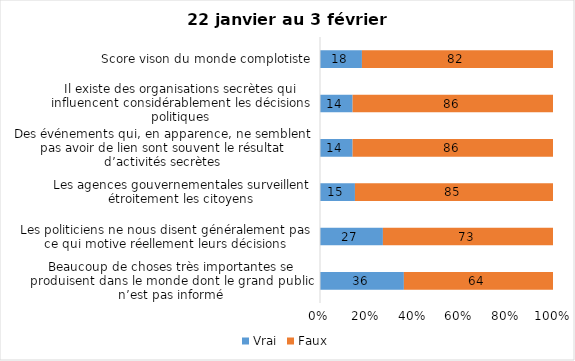
| Category | Vrai | Faux |
|---|---|---|
| Beaucoup de choses très importantes se produisent dans le monde dont le grand public n’est pas informé | 36 | 64 |
| Les politiciens ne nous disent généralement pas ce qui motive réellement leurs décisions | 27 | 73 |
| Les agences gouvernementales surveillent étroitement les citoyens | 15 | 85 |
| Des événements qui, en apparence, ne semblent pas avoir de lien sont souvent le résultat d’activités secrètes | 14 | 86 |
| Il existe des organisations secrètes qui influencent considérablement les décisions politiques | 14 | 86 |
| Score vison du monde complotiste | 18 | 82 |